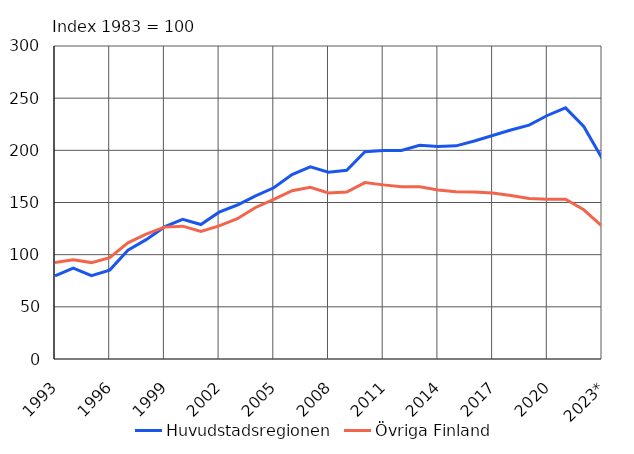
| Category | Huvudstadsregionen | Övriga Finland |
|---|---|---|
| 1993 | 79.6 | 92.5 |
| 1994 | 87.2 | 95.2 |
| 1995 | 79.8 | 92.4 |
| 1996 | 85.2 | 97.2 |
| 1997 | 104.2 | 111.4 |
| 1998 | 114.4 | 119.6 |
| 1999 | 126.6 | 126.4 |
| 2000 | 133.8 | 127.3 |
| 2001 | 128.9 | 122.2 |
| 2002 | 140.7 | 127.6 |
| 2003 | 147.6 | 134.5 |
| 2004 | 156.3 | 145.2 |
| 2005 | 164.1 | 153.1 |
| 2006 | 176.8 | 161.3 |
| 2007 | 184.2 | 164.5 |
| 2008 | 179.1 | 159.1 |
| 2009 | 180.8 | 160 |
| 2010 | 198.6 | 169.1 |
| 2011 | 199.8 | 166.9 |
| 2012 | 199.9 | 165 |
| 2013 | 204.8 | 165 |
| 2014 | 203.7 | 161.9 |
| 2015 | 204.3 | 160.4 |
| 2016 | 208.9 | 160.1 |
| 2017 | 214.2 | 159.2 |
| 2018 | 219.5 | 156.8 |
| 2019 | 224.2 | 153.8 |
| 2020 | 233.4 | 153.1 |
| 2021 | 240.7 | 153.1 |
| 2022 | 222.9 | 143 |
| 2023* | 192.5 | 127.4 |